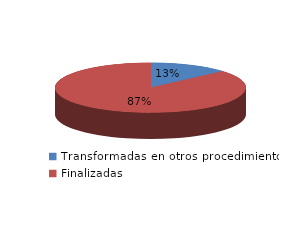
| Category | Series 0 |
|---|---|
| Transformadas en otros procedimientos | 5004 |
| Finalizadas | 32255 |